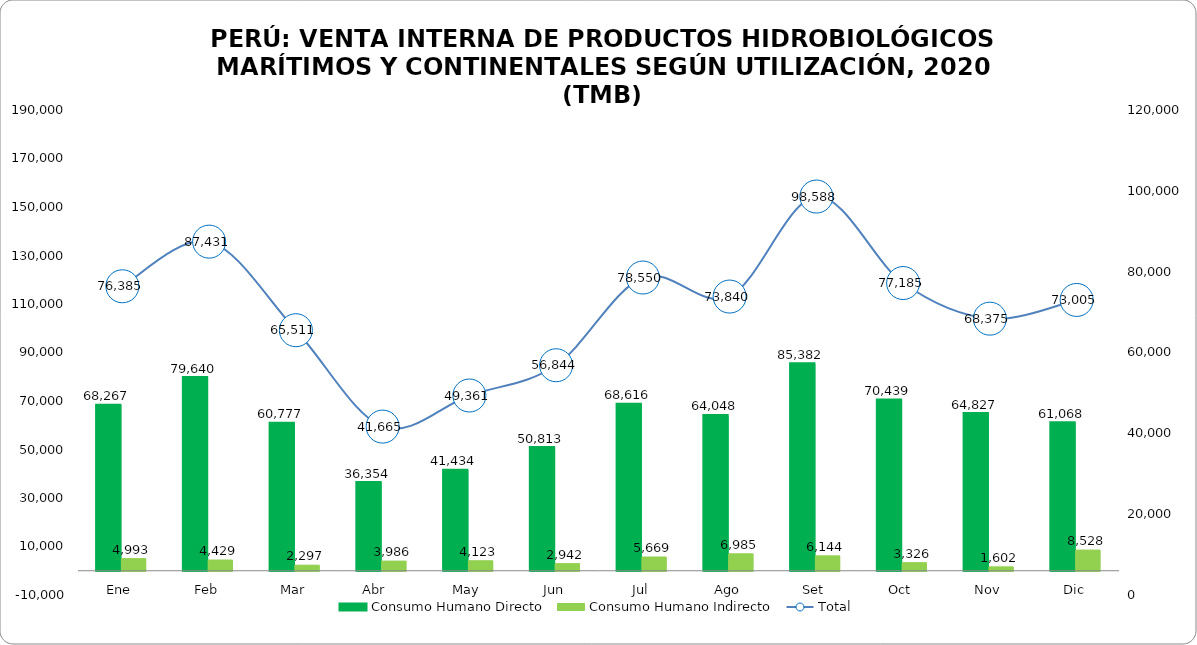
| Category | Consumo Humano Directo | Consumo Humano Indirecto |
|---|---|---|
| Ene | 68267.28 | 4993 |
| Feb | 79639.75 | 4429 |
| Mar | 60776.564 | 2297 |
| Abr    | 36353.683 | 3986 |
| May | 41433.833 | 4123 |
| Jun | 50812.704 | 2942 |
| Jul | 68615.831 | 5669 |
| Ago | 64048.468 | 6985 |
| Set | 85382.256 | 6144 |
| Oct | 70438.533 | 3326 |
| Nov | 64826.922 | 1602 |
| Dic | 61068.006 | 8528 |